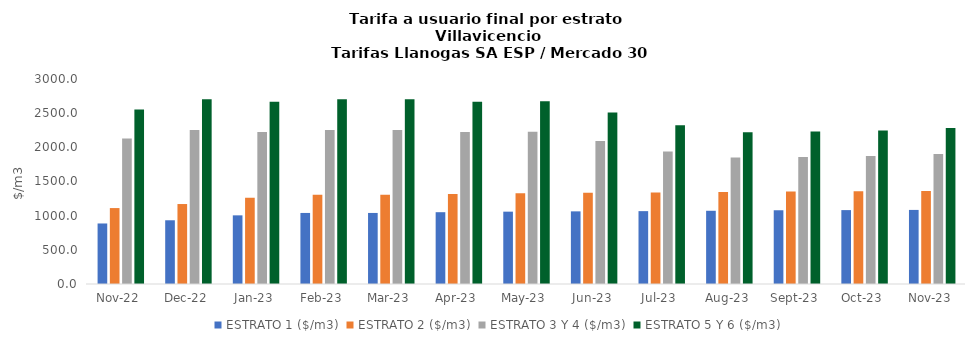
| Category | ESTRATO 1 ($/m3) | ESTRATO 2 ($/m3) | ESTRATO 3 Y 4 ($/m3) | ESTRATO 5 Y 6 ($/m3) |
|---|---|---|---|---|
| 2022-11-01 | 885.71 | 1111.19 | 2128.04 | 2553.648 |
| 2022-12-01 | 932.64 | 1170.28 | 2251.92 | 2702.304 |
| 2023-01-01 | 1004.76 | 1260.83 | 2223.64 | 2668.368 |
| 2023-02-01 | 1039.76 | 1304.76 | 2251.92 | 2702.304 |
| 2023-03-01 | 1039.76 | 1304.76 | 2251.92 | 2702.304 |
| 2023-04-01 | 1050.8 | 1318.62 | 2223.64 | 2668.368 |
| 2023-05-01 | 1058.67 | 1328.49 | 2227.49 | 2672.988 |
| 2023-06-01 | 1063.04 | 1333.97 | 2092.35 | 2510.82 |
| 2023-07-01 | 1066.3 | 1338.06 | 1937.39 | 2324.868 |
| 2023-08-01 | 1071.54 | 1344.64 | 1852.08 | 2222.496 |
| 2023-09-01 | 1079.09 | 1354.11 | 1858.9 | 2230.68 |
| 2023-10-01 | 1081.39 | 1357 | 1871.96 | 2246.352 |
| 2023-11-01 | 1084.09 | 1360.39 | 1903.33 | 2283.996 |